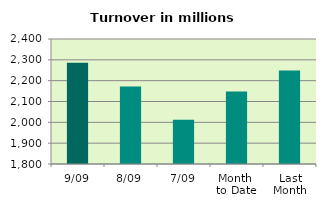
| Category | Series 0 |
|---|---|
| 9/09 | 2285.914 |
| 8/09 | 2172.419 |
| 7/09 | 2011.936 |
| Month 
to Date | 2147.648 |
| Last
Month | 2249.305 |